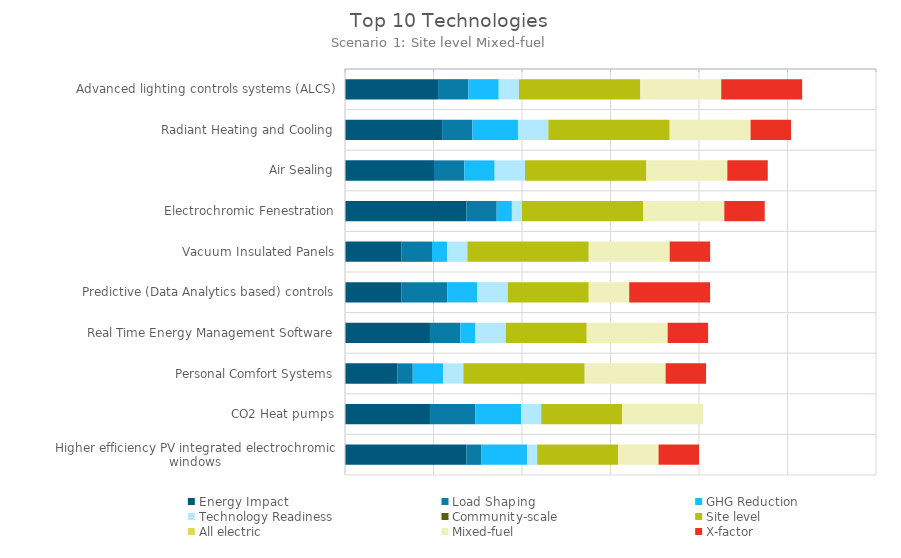
| Category | Energy Impact | Load Shaping | GHG Reduction | Technology Readiness | Community-scale | Site level | All electric | Mixed-fuel | X-factor |
|---|---|---|---|---|---|---|---|---|---|
| Higher efficiency PV integrated electrochromic windows | 0.343 | 0.043 | 0.129 | 0.029 | 0 | 0.229 | 0 | 0.114 | 0.114 |
| CO2 Heat pumps | 0.24 | 0.129 | 0.129 | 0.057 | 0 | 0.229 | 0 | 0.229 | 0 |
| Personal Comfort Systems | 0.149 | 0.043 | 0.086 | 0.057 | 0 | 0.343 | 0 | 0.229 | 0.114 |
| Real Time Energy Management Software | 0.24 | 0.086 | 0.043 | 0.086 | 0 | 0.229 | 0 | 0.229 | 0.114 |
| Predictive (Data Analytics based) controls | 0.16 | 0.129 | 0.086 | 0.086 | 0 | 0.229 | 0 | 0.114 | 0.229 |
| Vacuum Insulated Panels | 0.16 | 0.086 | 0.043 | 0.057 | 0 | 0.343 | 0 | 0.229 | 0.114 |
| Electrochromic Fenestration | 0.343 | 0.086 | 0.043 | 0.029 | 0 | 0.343 | 0 | 0.229 | 0.114 |
| Air Sealing | 0.251 | 0.086 | 0.086 | 0.086 | 0 | 0.343 | 0 | 0.229 | 0.114 |
| Radiant Heating and Cooling | 0.274 | 0.086 | 0.129 | 0.086 | 0 | 0.343 | 0 | 0.229 | 0.114 |
| Advanced lighting controls systems (ALCS) | 0.263 | 0.086 | 0.086 | 0.057 | 0 | 0.343 | 0 | 0.229 | 0.229 |